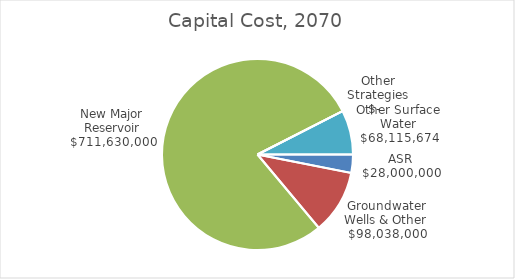
| Category | Series 0 |
|---|---|
| ASR | 28000000 |
| Groundwater Wells & Other | 98038000 |
| New Major Reservoir | 711630000 |
| Other Strategies | 0 |
| Other Surface Water | 68115674 |